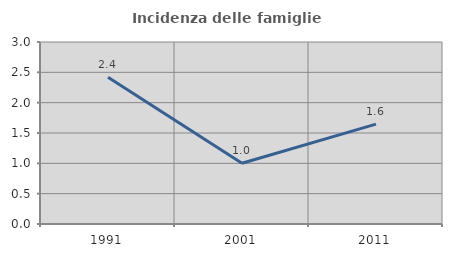
| Category | Incidenza delle famiglie numerose |
|---|---|
| 1991.0 | 2.419 |
| 2001.0 | 1.002 |
| 2011.0 | 1.646 |